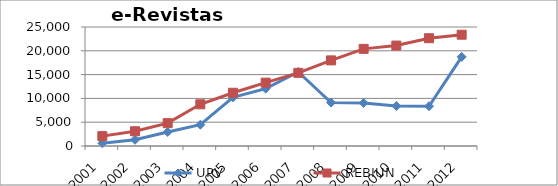
| Category | UPV | REBIUN |
|---|---|---|
| 2001 | 572 | 2075.583 |
| 2002 | 1309 | 3097.125 |
| 2003 | 2947 | 4797.042 |
| 2004 | 4472 | 8761.469 |
| 2005 | 10216 | 11188.714 |
| 2006 | 12047 | 13312.469 |
| 2007 | 15548 | 15367.735 |
| 2008 | 9122 | 17985.98 |
| 2009 | 9045 | 20407.327 |
| 2010 | 8387 | 21099.531 |
| 2011 | 8354 | 22640 |
| 2012 | 18722 | 23381 |